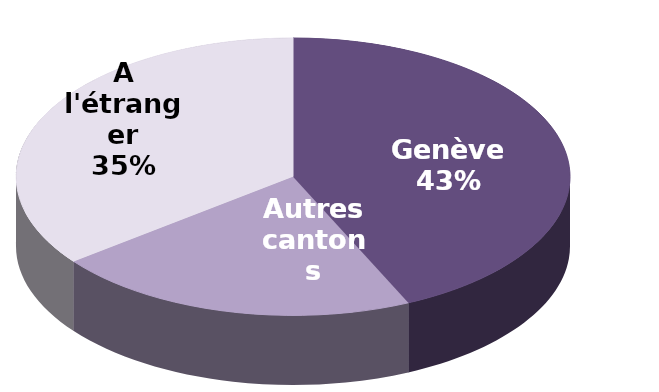
| Category | Series 0 |
|---|---|
| Genève | 2241 |
| Autres cantons | 1109 |
| A l'étranger | 1841 |